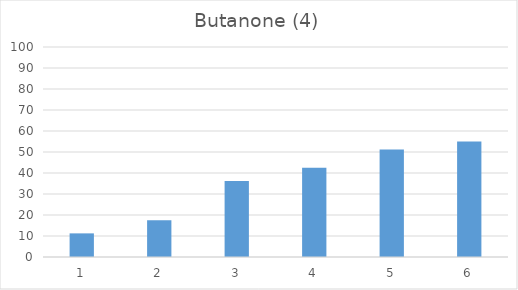
| Category | Series 0 |
|---|---|
| 0 | 11.25 |
| 1 | 17.5 |
| 2 | 36.25 |
| 3 | 42.5 |
| 4 | 51.25 |
| 5 | 55 |